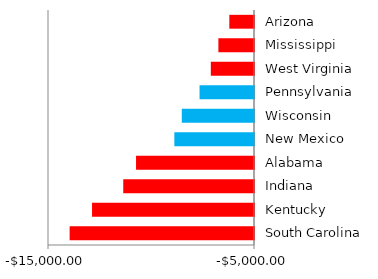
| Category | Series 0 |
|---|---|
| South Carolina | -13950.061 |
| Kentucky | -12861.863 |
| Indiana | -11347.223 |
| Alabama | -10726.155 |
| New Mexico | -8866.902 |
| Wisconsin | -8505.883 |
| Pennsylvania | -7643.428 |
| West Virginia | -7096.232 |
| Mississippi | -6728.832 |
| Arizona | -6198.015 |